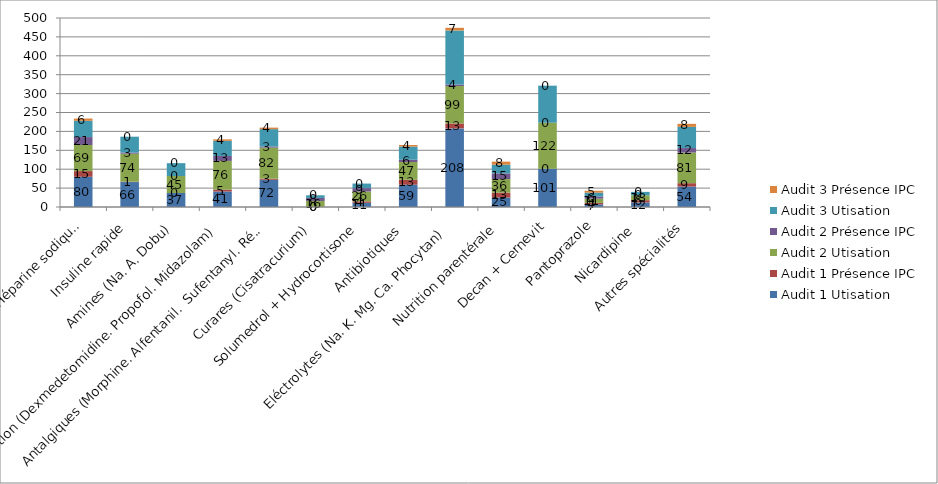
| Category | Audit 1 | Audit 2 | Audit 3 |
|---|---|---|---|
| Héparine sodique  | 15 | 21 | 6 |
| Insuline rapide | 1 | 3 | 0 |
| Amines (Na. A. Dobu) | 0 | 0 | 0 |
| Sédation (Dexmedetomidine. Propofol. Midazolam) | 5 | 13 | 4 |
| Antalgiques (Morphine. Alfentanil.  Sufentanyl. Rémifentanyl. Nefopam) | 3 | 3 | 4 |
| Curares (Cisatracurium) | 0 | 8 | 0 |
| Solumedrol + Hydrocortisone | 4 | 9 | 0 |
| Antibiotiques  | 13 | 6 | 4 |
| Eléctrolytes (Na. K. Mg. Ca. Phocytan)  | 13 | 4 | 7 |
| Nutrition parentérale | 13 | 15 | 8 |
| Decan + Cernevit | 0 | 0 | 0 |
| Pantoprazole | 4 | 6 | 5 |
| Nicardipine  | 6 | 0 | 0 |
| Autres spécialités | 9 | 12 | 8 |